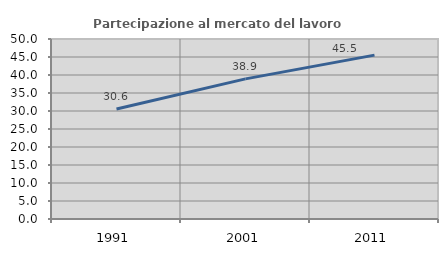
| Category | Partecipazione al mercato del lavoro  femminile |
|---|---|
| 1991.0 | 30.567 |
| 2001.0 | 38.924 |
| 2011.0 | 45.516 |